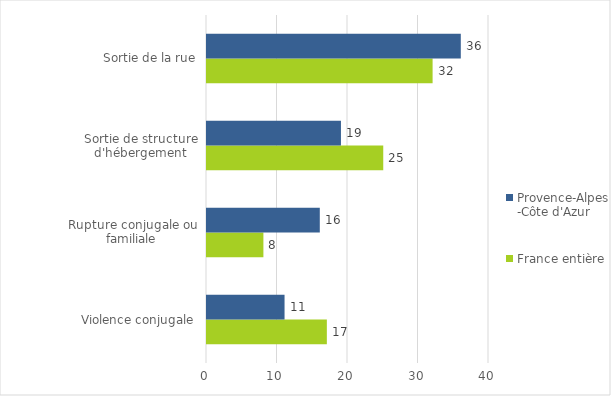
| Category | France entière | Provence-Alpes-Côte d'Azur |
|---|---|---|
| Violence conjugale | 17 | 11 |
| Rupture conjugale ou familiale | 8 | 16 |
| Sortie de structure d'hébergement | 25 | 19 |
| Sortie de la rue | 32 | 36 |